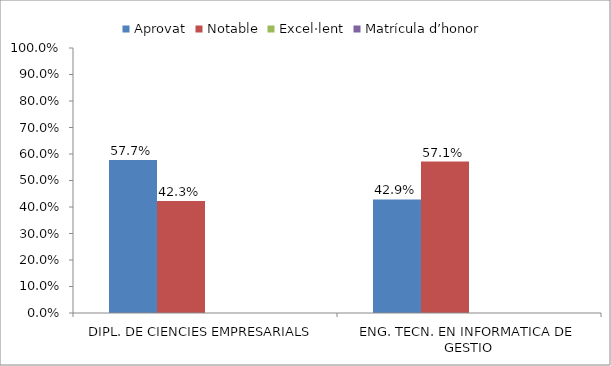
| Category | Aprovat | Notable | Excel·lent | Matrícula d’honor |
|---|---|---|---|---|
| DIPL. DE CIENCIES EMPRESARIALS | 0.577 | 0.423 | 0 | 0 |
| ENG. TECN. EN INFORMATICA DE GESTIO | 0.429 | 0.571 | 0 | 0 |